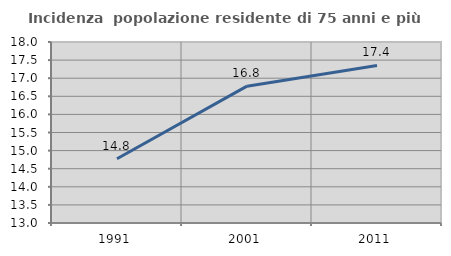
| Category | Incidenza  popolazione residente di 75 anni e più |
|---|---|
| 1991.0 | 14.776 |
| 2001.0 | 16.78 |
| 2011.0 | 17.353 |